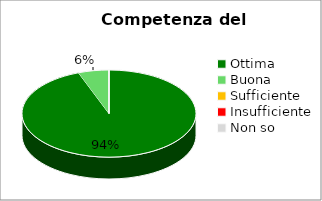
| Category | Series 0 |
|---|---|
| Ottima | 33 |
| Buona | 2 |
| Sufficiente | 0 |
| Insufficiente | 0 |
| Non so | 0 |